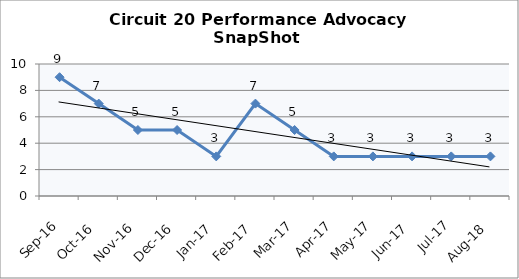
| Category | Circuit 20 |
|---|---|
| Sep-16 | 9 |
| Oct-16 | 7 |
| Nov-16 | 5 |
| Dec-16 | 5 |
| Jan-17 | 3 |
| Feb-17 | 7 |
| Mar-17 | 5 |
| Apr-17 | 3 |
| May-17 | 3 |
| Jun-17 | 3 |
| Jul-17 | 3 |
| Aug-18 | 3 |